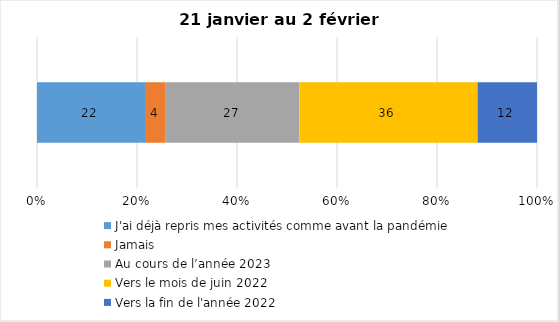
| Category | J'ai déjà repris mes activités comme avant la pandémie | Jamais | Au cours de l’année 2023 | Vers le mois de juin 2022 | Vers la fin de l'année 2022 |
|---|---|---|---|---|---|
| 0 | 22 | 4 | 27 | 36 | 12 |